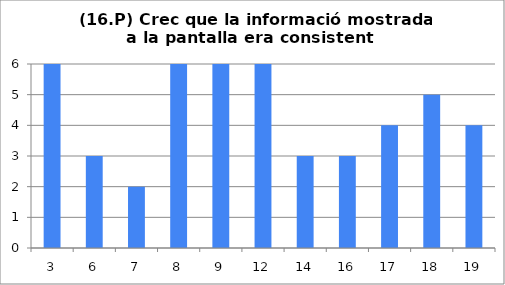
| Category | 16 |
|---|---|
| 3.0 | 6 |
| 6.0 | 3 |
| 7.0 | 2 |
| 8.0 | 6 |
| 9.0 | 6 |
| 12.0 | 6 |
| 14.0 | 3 |
| 16.0 | 3 |
| 17.0 | 4 |
| 18.0 | 5 |
| 19.0 | 4 |